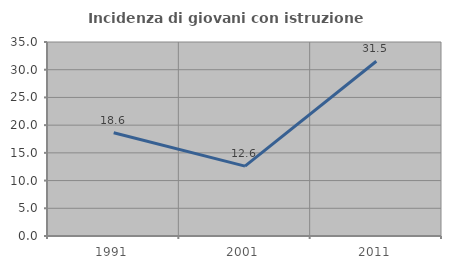
| Category | Incidenza di giovani con istruzione universitaria |
|---|---|
| 1991.0 | 18.627 |
| 2001.0 | 12.605 |
| 2011.0 | 31.532 |